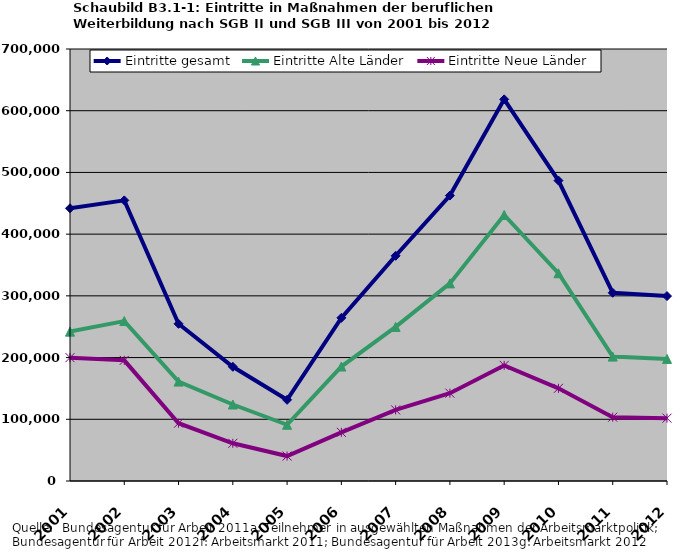
| Category | Eintritte gesamt | Eintritte Alte Länder | Eintritte Neue Länder |
|---|---|---|---|
| 2001.0 | 441907 | 242012 | 199895 |
| 2002.0 | 454699 | 259166 | 195533 |
| 2003.0 | 254718 | 161042 | 93676 |
| 2004.0 | 185041 | 123952 | 61089 |
| 2005.0 | 131521 | 91096 | 40425 |
| 2006.0 | 264343 | 185457 | 78886 |
| 2007.0 | 364894 | 249675 | 115219 |
| 2008.0 | 462532 | 320217 | 142315 |
| 2009.0 | 618435 | 431065 | 187370 |
| 2010.0 | 486795 | 336627 | 150168 |
| 2011.0 | 304991 | 201560 | 103431 |
| 2012.0 | 299652 | 197840 | 101812 |